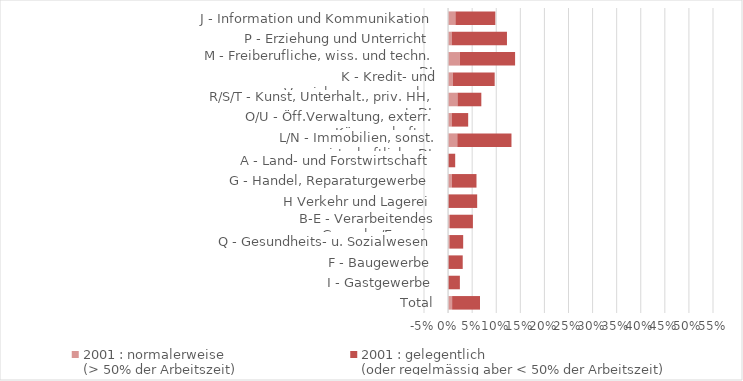
| Category | 2001 : normalerweise  
(> 50% der Arbeitszeit) | 2001 : gelegentlich
(oder regelmässig aber < 50% der Arbeitszeit) |
|---|---|---|
| Total | 0.008 | 0.058 |
| I - Gastgewerbe | 0 | 0.024 |
| F - Baugewerbe | 0 | 0.03 |
| Q - Gesundheits- u. Sozialwesen | 0.003 | 0.028 |
| B-E - Verarbeitendes Gewerbe/Energie | 0.004 | 0.048 |
| H Verkehr und Lagerei | 0 | 0.06 |
| G - Handel, Reparaturgewerbe | 0.008 | 0.051 |
| A - Land- und Forstwirtschaft | 0 | 0.015 |
| L/N - Immobilien, sonst. wirtschaftliche DL | 0.019 | 0.113 |
| O/U - Öff.Verwaltung, exterr. Körperschaften | 0.007 | 0.034 |
| R/S/T - Kunst, Unterhalt., priv. HH, sonst. DL | 0.02 | 0.049 |
| K - Kredit- und Versicherungsgewerbe | 0.01 | 0.087 |
| M - Freiberufliche, wiss. und techn. DL | 0.024 | 0.115 |
| P - Erziehung und Unterricht | 0.007 | 0.115 |
| J - Information und Kommunikation | 0.015 | 0.083 |